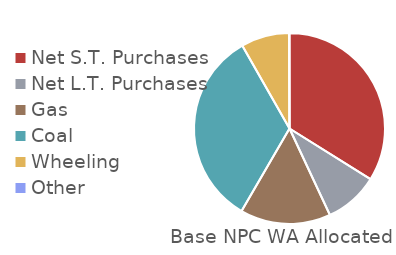
| Category | 2022 Base NPC |
|---|---|
| Net S.T. Purchases | 46830666.695 |
| Net L.T. Purchases | 12635132.52 |
| Gas | 21174095.561 |
| Coal  | 46119186.783 |
| Wheeling | 11261017.237 |
| Other | -121107.256 |